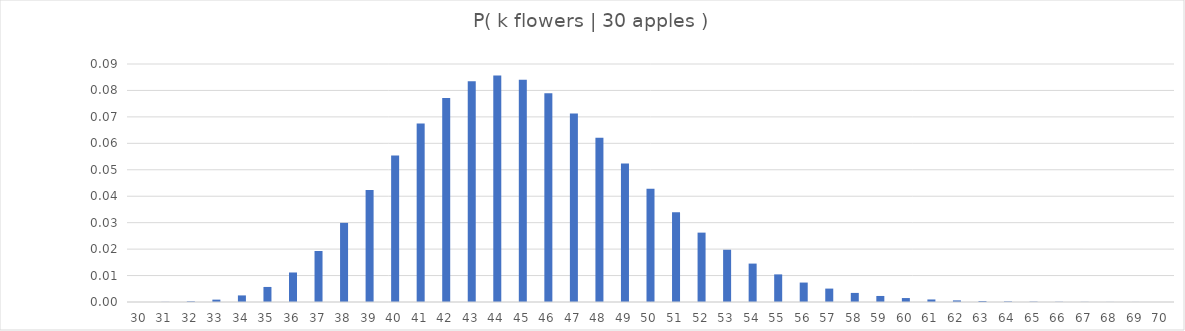
| Category | Series 0 |
|---|---|
| 30.0 | 0 |
| 31.0 | 0 |
| 32.0 | 0 |
| 33.0 | 0.001 |
| 34.0 | 0.002 |
| 35.0 | 0.006 |
| 36.0 | 0.011 |
| 37.0 | 0.019 |
| 38.0 | 0.03 |
| 39.0 | 0.042 |
| 40.0 | 0.055 |
| 41.0 | 0.067 |
| 42.0 | 0.077 |
| 43.0 | 0.083 |
| 44.0 | 0.086 |
| 45.0 | 0.084 |
| 46.0 | 0.079 |
| 47.0 | 0.071 |
| 48.0 | 0.062 |
| 49.0 | 0.052 |
| 50.0 | 0.043 |
| 51.0 | 0.034 |
| 52.0 | 0.026 |
| 53.0 | 0.02 |
| 54.0 | 0.015 |
| 55.0 | 0.01 |
| 56.0 | 0.007 |
| 57.0 | 0.005 |
| 58.0 | 0.003 |
| 59.0 | 0.002 |
| 60.0 | 0.001 |
| 61.0 | 0.001 |
| 62.0 | 0.001 |
| 63.0 | 0 |
| 64.0 | 0 |
| 65.0 | 0 |
| 66.0 | 0 |
| 67.0 | 0 |
| 68.0 | 0 |
| 69.0 | 0 |
| 70.0 | 0 |